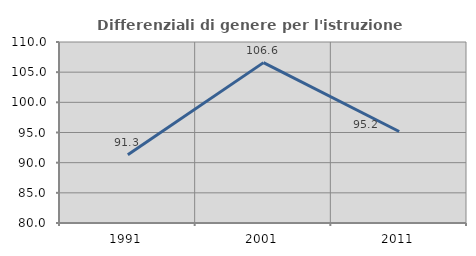
| Category | Differenziali di genere per l'istruzione superiore |
|---|---|
| 1991.0 | 91.302 |
| 2001.0 | 106.581 |
| 2011.0 | 95.167 |